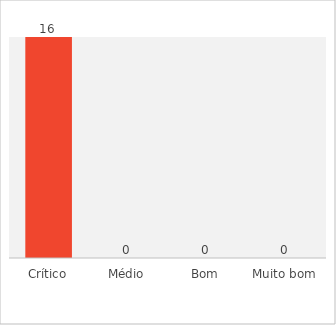
| Category | Volume |
|---|---|
| Crítico | 16 |
| Médio | 0 |
| Bom | 0 |
| Muito bom | 0 |